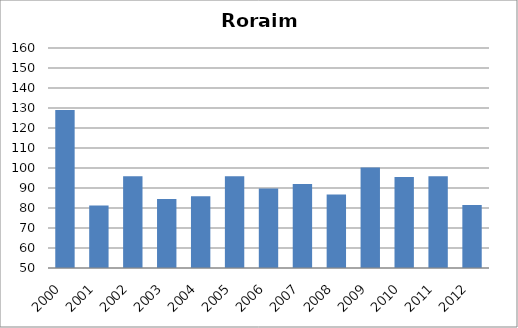
| Category | Tetravalente/DTP |
|---|---|
| 2000.0 | 128.99 |
| 2001.0 | 81.27 |
| 2002.0 | 95.86 |
| 2003.0 | 84.51 |
| 2004.0 | 85.92 |
| 2005.0 | 95.9 |
| 2006.0 | 89.81 |
| 2007.0 | 92.05 |
| 2008.0 | 86.71 |
| 2009.0 | 100.22 |
| 2010.0 | 95.49 |
| 2011.0 | 95.91 |
| 2012.0 | 81.44 |